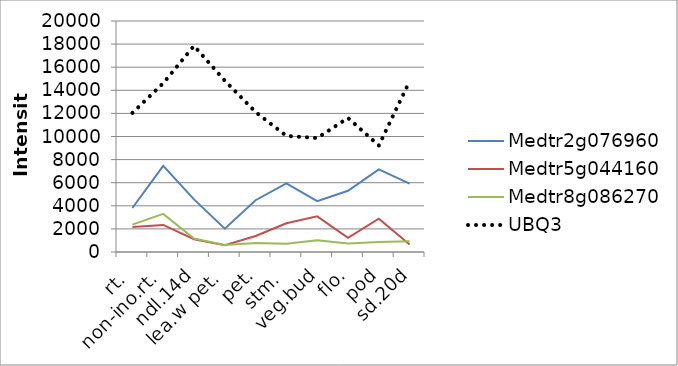
| Category | Medtr2g076960 | Medtr5g044160 | Medtr8g086270 | UBQ3 |
|---|---|---|---|---|
| rt. | 3809.89 | 2154.87 | 2367.24 | 12045.2 |
| non-ino.rt. | 7452.84 | 2342.26 | 3300.73 | 14609.86 |
| ndl.14d | 4556.67 | 1105.89 | 1165.33 | 17849.43 |
| lea.w pet. | 2014.5 | 589.47 | 602.98 | 14836 |
| pet. | 4483.65 | 1388.8 | 769.31 | 12116.6 |
| stm. | 5934.63 | 2486.57 | 723.49 | 10054.36 |
| veg.bud | 4403.74 | 3084.81 | 1014.8 | 9863.88 |
| flo. | 5298.02 | 1219.4 | 726.57 | 11607.4 |
| pod | 7157.06 | 2887.93 | 862.35 | 9222.41 |
| sd.20d | 5912.96 | 653.34 | 920.38 | 14787.86 |